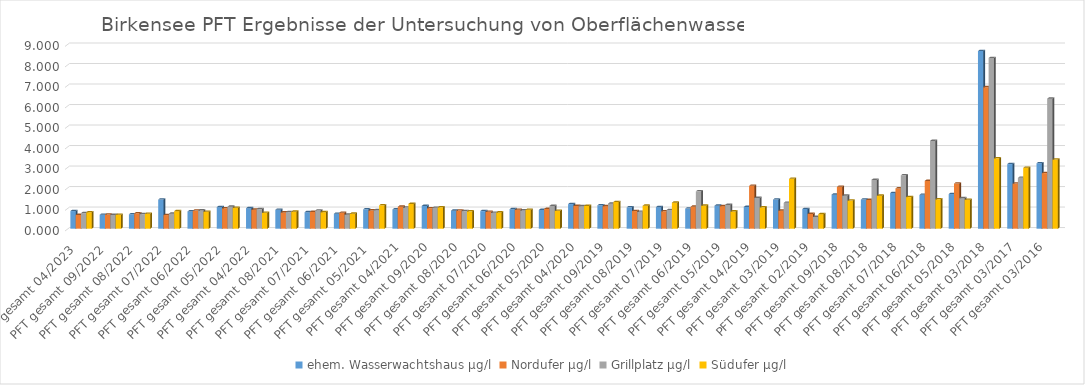
| Category | ehem. Wasserwachtshaus | Nordufer | Grillplatz | Südufer |
|---|---|---|---|---|
| PFT gesamt 04/2023  | 0.86 | 0.67 | 0.76 | 0.8 |
| PFT gesamt 09/2022  | 0.678 | 0.689 | 0.669 | 0.677 |
| PFT gesamt 08/2022  | 0.702 | 0.75 | 0.711 | 0.726 |
| PFT gesamt 07/2022  | 1.42 | 0.665 | 0.733 | 0.855 |
| PFT gesamt 06/2022  | 0.839 | 0.881 | 0.891 | 0.824 |
| PFT gesamt 05/2022  | 1.05 | 0.996 | 1.07 | 1.02 |
| PFT gesamt 04/2022  | 1 | 0.928 | 0.956 | 0.772 |
| PFT gesamt 08/2021  | 0.923 | 0.794 | 0.81 | 0.828 |
| PFT gesamt 07/2021  | 0.803 | 0.819 | 0.886 | 0.803 |
| PFT gesamt 06/2021  | 0.728 | 0.775 | 0.68 | 0.73 |
| PFT gesamt 05/2021  | 0.944 | 0.887 | 0.904 | 1.14 |
| PFT gesamt 04/2021 | 0.937 | 1.07 | 1.03 | 1.21 |
| PFT gesamt 09/2020 | 1.11 | 0.995 | 1.02 | 1.04 |
| PFT gesamt 08/2020 | 0.878 | 0.884 | 0.858 | 0.846 |
| PFT gesamt 07/2020 | 0.858 | 0.82 | 0.774 | 0.791 |
| PFT gesamt 06/2020 | 0.948 | 0.922 | 0.893 | 0.921 |
| PFT gesamt 05/2020 | 0.914 | 0.961 | 1.11 | 0.87 |
| PFT gesamt 04/2020 | 1.2 | 1.11 | 1.1 | 1.11 |
| PFT gesamt 09/2019 | 1.14 | 1.1 | 1.22 | 1.3 |
| PFT gesamt 08/2019 | 1.04 | 0.86 | 0.82 | 1.12 |
| PFT gesamt 07/2019 | 1.05 | 0.85 | 0.91 | 1.27 |
| PFT gesamt 06/2019 | 0.98 | 1.07 | 1.82 | 1.12 |
| PFT gesamt 05/2019 | 1.12 | 1.1 | 1.16 | 0.84 |
| PFT gesamt 04/2019 | 1.06 | 2.09 | 1.5 | 1.04 |
| PFT gesamt 03/2019 | 1.42 | 0.88 | 1.26 | 2.43 |
| PFT gesamt 02/2019 | 0.96 | 0.72 | 0.57 | 0.71 |
| PFT gesamt 09/2018 | 1.66 | 2.04 | 1.61 | 1.37 |
| PFT gesamt 08/2018 | 1.42 | 1.4 | 2.38 | 1.61 |
| PFT gesamt 07/2018 | 1.74 | 1.96 | 2.6 | 1.54 |
| PFT gesamt 06/2018 | 1.65 | 2.33 | 4.28 | 1.43 |
| PFT gesamt 05/2018 | 1.69 | 2.2 | 1.49 | 1.41 |
| PFT gesamt 03/2018 | 8.66 | 6.9 | 8.32 | 3.43 |
| PFT gesamt 03/2017 | 3.15 | 2.2 | 2.48 | 2.97 |
| PFT gesamt 03/2016 | 3.19 | 2.71 | 6.34 | 3.37 |